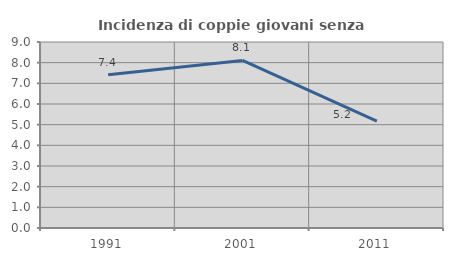
| Category | Incidenza di coppie giovani senza figli |
|---|---|
| 1991.0 | 7.412 |
| 2001.0 | 8.105 |
| 2011.0 | 5.173 |